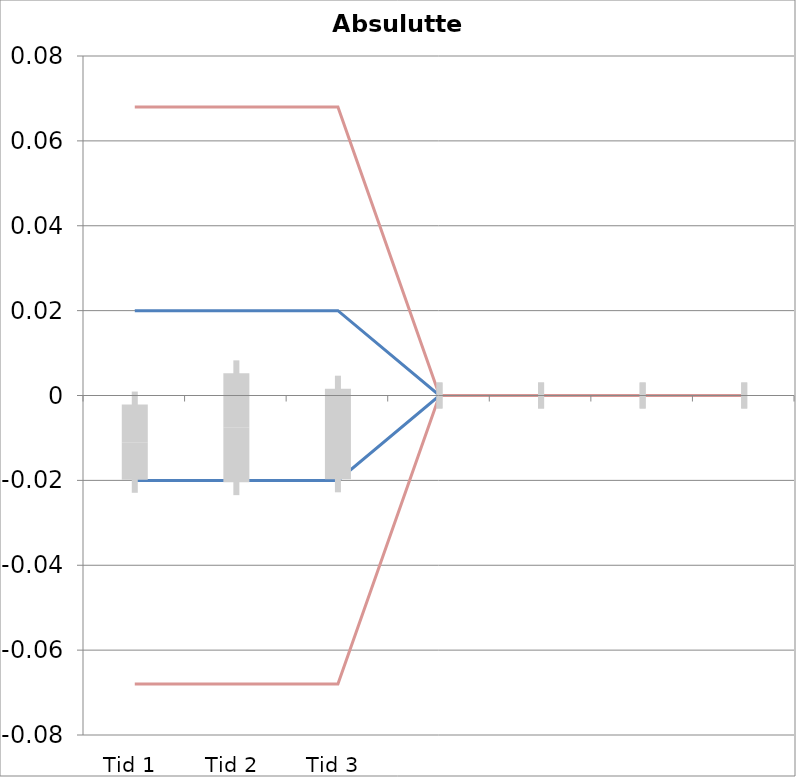
| Category | 1 | 2 | 3 | 4 | 5 | 6 | 7 | 8 | 9 | 10 | 11 | 12 | 13 | 14 | 15 | 16 | 17 | 18 | 19 | 20 | TEa | B | -B | -TEa | M |
|---|---|---|---|---|---|---|---|---|---|---|---|---|---|---|---|---|---|---|---|---|---|---|---|---|---|
| Tid 1 | -0.01 | -0.01 | -0.006 | -0.01 | -0.03 | 0.008 | -0.016 | -0.027 | 0.018 | -0.011 | -0.007 | -0.022 | -0.009 | 0.011 | -0.044 | 0 | 0 | 0 | 0 | 0 | 0.068 | 0.02 | -0.02 | -0.068 | -0.011 |
| Tid 2 | 0.014 | -0.015 | 0.004 | -0.03 | -0.004 | 0.002 | -0.021 | -0.042 | 0.04 | 0.005 | -0.042 | -0.018 | -0.029 | 0.009 | 0.013 | 0 | 0 | 0 | 0 | 0 | 0.068 | 0.02 | -0.02 | -0.068 | -0.008 |
| Tid 3 | -0.01 | -0.01 | -0.01 | -0.04 | 0 | 0.013 | -0.004 | -0.04 | 0.019 | -0.003 | -0.007 | 0.003 | -0.023 | -0.028 | 0.013 | 0 | 0 | 0 | 0 | 0 | 0.068 | 0.02 | -0.02 | -0.068 | -0.009 |